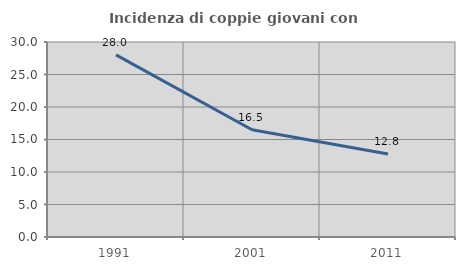
| Category | Incidenza di coppie giovani con figli |
|---|---|
| 1991.0 | 28.019 |
| 2001.0 | 16.5 |
| 2011.0 | 12.775 |